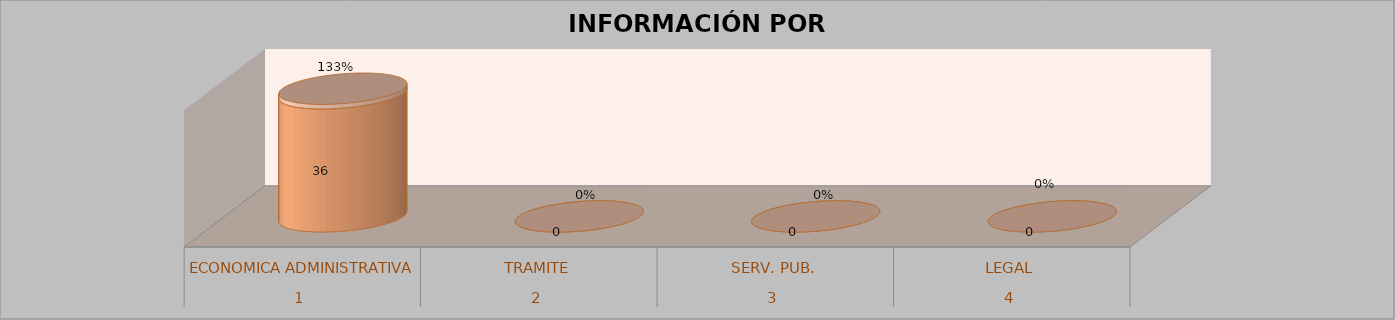
| Category | Series 0 | Series 1 | Series 2 | Series 3 |
|---|---|---|---|---|
| 0 |  |  | 36 | 1.333 |
| 1 |  |  | 0 | 0 |
| 2 |  |  | 0 | 0 |
| 3 |  |  | 0 | 0 |